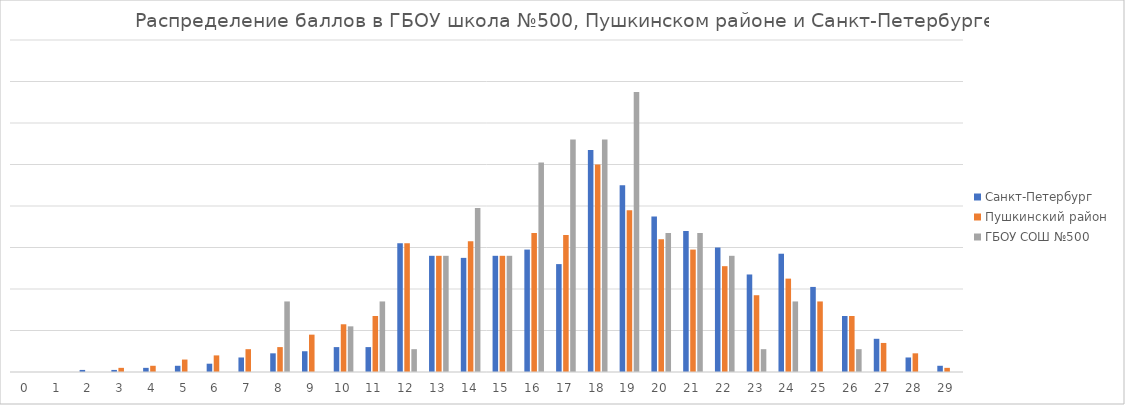
| Category | Санкт-Петербург | Пушкинский район | ГБОУ СОШ №500 |
|---|---|---|---|
| 0.0 | 0 | 0 | 0 |
| 1.0 | 0 | 0 | 0 |
| 2.0 | 0.1 | 0 | 0 |
| 3.0 | 0.1 | 0.2 | 0 |
| 4.0 | 0.2 | 0.3 | 0 |
| 5.0 | 0.3 | 0.6 | 0 |
| 6.0 | 0.4 | 0.8 | 0 |
| 7.0 | 0.7 | 1.1 | 0 |
| 8.0 | 0.9 | 1.2 | 3.4 |
| 9.0 | 1 | 1.8 | 0 |
| 10.0 | 1.2 | 2.3 | 2.2 |
| 11.0 | 1.2 | 2.7 | 3.4 |
| 12.0 | 6.2 | 6.2 | 1.1 |
| 13.0 | 5.6 | 5.6 | 5.6 |
| 14.0 | 5.5 | 6.3 | 7.9 |
| 15.0 | 5.6 | 5.6 | 5.6 |
| 16.0 | 5.9 | 6.7 | 10.1 |
| 17.0 | 5.2 | 6.6 | 11.2 |
| 18.0 | 10.7 | 10 | 11.2 |
| 19.0 | 9 | 7.8 | 13.5 |
| 20.0 | 7.5 | 6.4 | 6.7 |
| 21.0 | 6.8 | 5.9 | 6.7 |
| 22.0 | 6 | 5.1 | 5.6 |
| 23.0 | 4.7 | 3.7 | 1.1 |
| 24.0 | 5.7 | 4.5 | 3.4 |
| 25.0 | 4.1 | 3.4 | 0 |
| 26.0 | 2.7 | 2.7 | 1.1 |
| 27.0 | 1.6 | 1.4 | 0 |
| 28.0 | 0.7 | 0.9 | 0 |
| 29.0 | 0.3 | 0.2 | 0 |